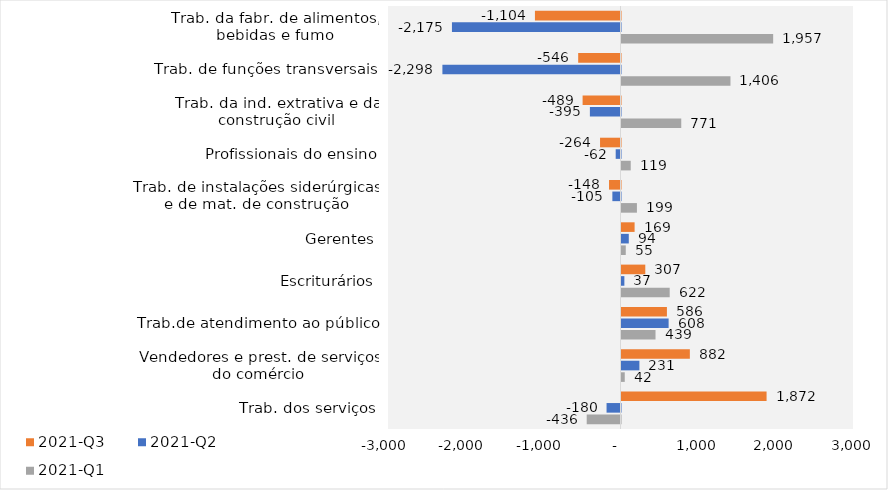
| Category | 2021-Q1 | 2021-Q2 | 2021-Q3 |
|---|---|---|---|
| Trab. dos serviços | -436 | -180 | 1872 |
| Vendedores e prest. de serviços do comércio | 42 | 231 | 882 |
| Trab.de atendimento ao público | 439 | 608 | 586 |
| Escriturários | 622 | 37 | 307 |
| Gerentes | 55 | 94 | 169 |
| Trab. de instalações siderúrgicas e de mat. de construção | 199 | -105 | -148 |
| Profissionais do ensino | 119 | -62 | -264 |
| Trab. da ind. extrativa e da construção civil | 771 | -395 | -489 |
| Trab. de funções transversais | 1406 | -2298 | -546 |
| Trab. da fabr. de alimentos, bebidas e fumo | 1957 | -2175 | -1104 |